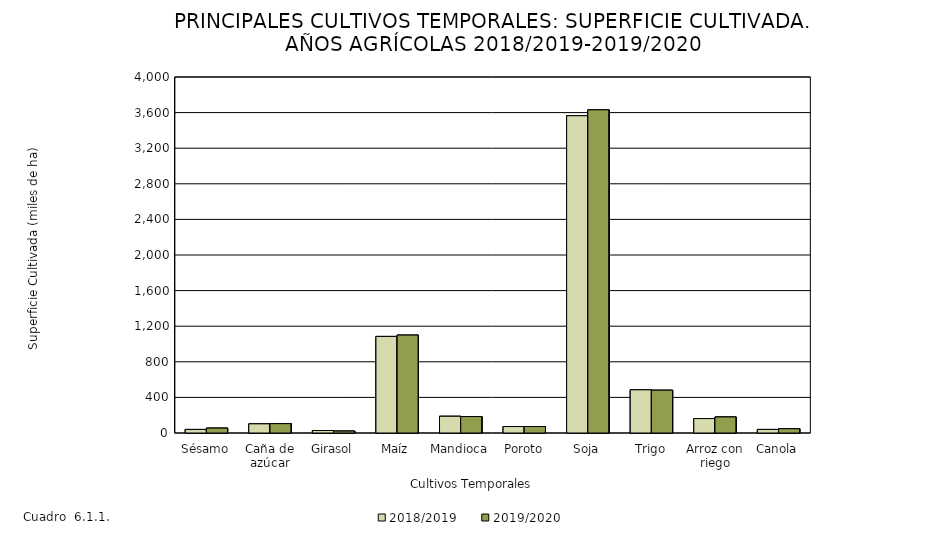
| Category | 2018/2019 | 2019/2020 |
|---|---|---|
| Sésamo | 40 | 55 |
| Caña de azúcar | 103 | 105 |
| Girasol | 28 | 21.6 |
| Maíz | 1085.005 | 1100 |
| Mandioca | 188 | 185 |
| Poroto | 72.801 | 72.805 |
| Soja | 3565 | 3631 |
| Trigo | 485 | 480.8 |
| Arroz con riego | 162 | 180 |
| Canola | 40 | 47.85 |